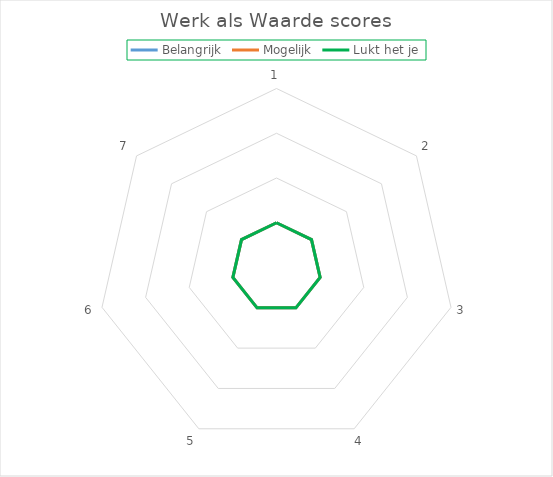
| Category | Belangrijk | Mogelijk | Lukt het je |
|---|---|---|---|
| 0 | 0 | 0 | 0 |
| 1 | 0 | 0 | 0 |
| 2 | 0 | 0 | 0 |
| 3 | 0 | 0 | 0 |
| 4 | 0 | 0 | 0 |
| 5 | 0 | 0 | 0 |
| 6 | 0 | 0 | 0 |